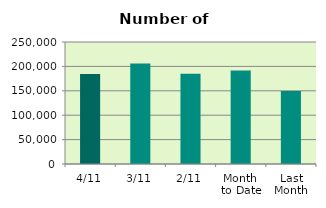
| Category | Series 0 |
|---|---|
| 4/11 | 184520 |
| 3/11 | 205786 |
| 2/11 | 185006 |
| Month 
to Date | 191770.667 |
| Last
Month | 149554.818 |